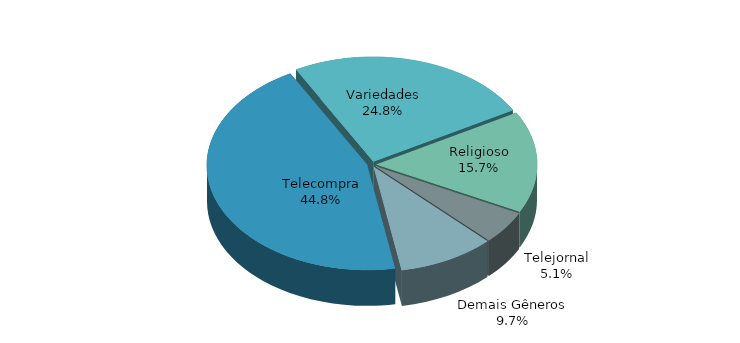
| Category | Series 0 |
|---|---|
| Telecompra | 0.448 |
| Variedades | 0.248 |
| Religioso | 0.157 |
| Telejornal | 0.051 |
| Demais Gêneros | 0.097 |